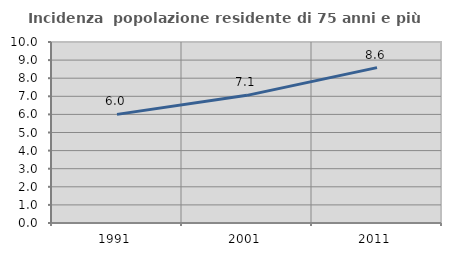
| Category | Incidenza  popolazione residente di 75 anni e più |
|---|---|
| 1991.0 | 6.001 |
| 2001.0 | 7.052 |
| 2011.0 | 8.586 |